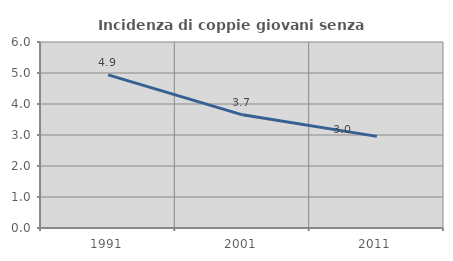
| Category | Incidenza di coppie giovani senza figli |
|---|---|
| 1991.0 | 4.938 |
| 2001.0 | 3.651 |
| 2011.0 | 2.956 |